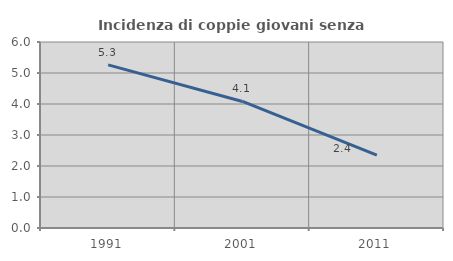
| Category | Incidenza di coppie giovani senza figli |
|---|---|
| 1991.0 | 5.263 |
| 2001.0 | 4.082 |
| 2011.0 | 2.353 |